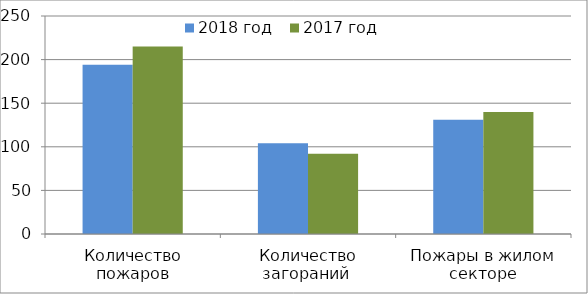
| Category | 2018 год | 2017 год |
|---|---|---|
| Количество пожаров | 194 | 215 |
| Количество загораний  | 104 | 92 |
| Пожары в жилом секторе | 131 | 140 |